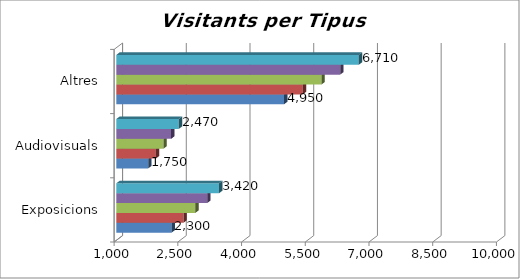
| Category | Any 2013 | Any 2014 | Any 2015 | Any 2016 | Any 2017 |
|---|---|---|---|---|---|
| Exposicions | 2300 | 2580 | 2860 | 3140 | 3420 |
| Audiovisuals | 1750 | 1930 | 2110 | 2290 | 2470 |
| Altres | 4950 | 5390 | 5830 | 6270 | 6710 |